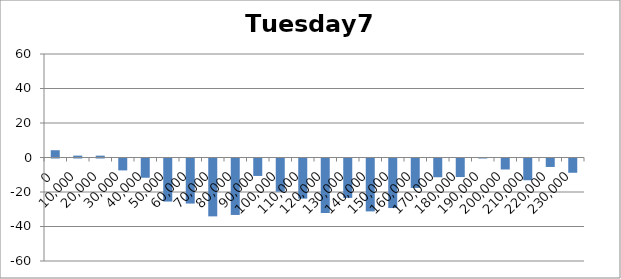
| Category | Tuesday72 |
|---|---|
| 0.0 | 4.22 |
| 10000.0 | 1.085 |
| 20000.0 | 1.07 |
| 30000.0 | -6.9 |
| 40000.0 | -11.15 |
| 50000.0 | -24.96 |
| 60000.0 | -26.13 |
| 70000.0 | -33.55 |
| 80000.0 | -32.725 |
| 90000.0 | -10.11 |
| 100000.0 | -19.22 |
| 110000.0 | -23.245 |
| 120000.0 | -31.61 |
| 130000.0 | -22.83 |
| 140000.0 | -30.665 |
| 150000.0 | -28.725 |
| 160000.0 | -17.065 |
| 170000.0 | -10.865 |
| 180000.0 | -10.745 |
| 190000.0 | 0.28 |
| 200000.0 | -6.365 |
| 210000.0 | -12.6 |
| 220000.0 | -4.907 |
| 230000.0 | -8.27 |